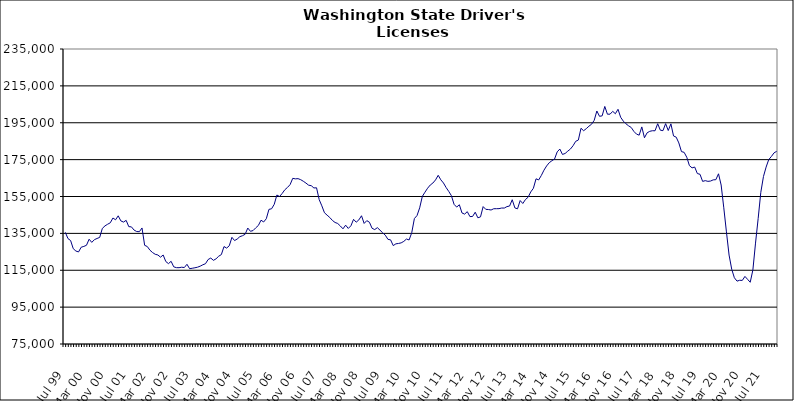
| Category | Series 0 |
|---|---|
| Jul 99 | 135560 |
| Aug 99 | 132182 |
| Sep 99 | 131104 |
| Oct 99 | 126694 |
| Nov 99 | 125425 |
| Dec 99 | 124927 |
| Jan 00 | 127499 |
| Feb 00 | 127927 |
| Mar 00 | 128547 |
| Apr 00 | 131834 |
| May 00 | 130120 |
| Jun 00 | 131595 |
| Jul 00 | 132236 |
| Aug 00 | 132819 |
| Sep 00 | 137711 |
| Oct 00 | 139063 |
| Nov 00 | 139952 |
| Dec 00 | 140732 |
| Jan 01 | 143338 |
| Feb 01 | 142359 |
| Mar 01 | 144523 |
| Apr 01 | 141758 |
| May 01 | 141135 |
| Jun 01 | 142064 |
| Jul 01 | 138646 |
| Aug 01 | 138530 |
| Sep 01 | 136784 |
| Oct 01 | 135996 |
| Nov 01 | 135917 |
| Dec 01 | 137940 |
| Jan 02 | 128531 |
| Feb 02 | 127848 |
| Mar 02 | 125876 |
| Apr 02 | 124595 |
| May 02 | 123660 |
| Jun 02 | 123282 |
| Jul 02 | 122089 |
| Aug 02 | 123279 |
| Sep 02 | 119727 |
| Oct 02 | 118588 |
| Nov 02 | 119854 |
| Dec 02 | 116851 |
| Jan 03 | 116407 |
| Feb 03 | 116382 |
| Mar 03 | 116648 |
| Apr 03 | 116471 |
| May 03 | 118231 |
| Jun 03 | 115831 |
| Jul 03 | 116082 |
| Aug 03 | 116341 |
| Sep 03 | 116653 |
| Oct 03 | 117212 |
| Nov 03 | 117962 |
| Dec 03 | 118542 |
| Jan 04 | 120817 |
| Feb 04 | 121617 |
| Mar 04 | 120369 |
| Apr 04 | 121200 |
| May 04 | 122609 |
| Jun 04 | 123484 |
| Jul 04 | 127844 |
| Aug 04 | 127025 |
| Sep 04 | 128273 |
| Oct 04 | 132853 |
| Nov 04 | 131106 |
| Dec 04 | 131935 |
| Jan 05 | 133205 |
| Feb 05 | 133736 |
| Mar 05 | 134528 |
| Apr 05 | 137889 |
| May 05 | 136130 |
| Jun 05 | 136523 |
| Jul 05 | 137997 |
| Aug 05 | 139294 |
| Sep 05 | 142140 |
| Oct 05 | 141192 |
| Nov 05 | 142937 |
| Dec 05 | 148013 |
| Jan 06 | 148341 |
| Feb 06 | 150744 |
| Mar 06 | 155794 |
| Apr 06 | 154984 |
| May 06 | 156651 |
| Jun 06 | 158638 |
| Jul 06 | 159911 |
| Aug 06 | 161445 |
| Sep 06 | 164852 |
| Oct 06 | 164570 |
| Nov 06 | 164679 |
| Dec 06 | 164127 |
| Jan 07 | 163271 |
| Feb 07 | 162273 |
| Mar 07 | 161140 |
| Apr 07 | 160860 |
| May 07 | 159633 |
| Jun 07 | 159724 |
| Jul 07 | 153303 |
| Aug 07 | 149939 |
| Sep 07 | 146172 |
| Oct 07 | 144876 |
| Nov 07 | 143613 |
| Dec 07 | 142022 |
| Jan 08 | 140909 |
| Feb 08 | 140368 |
| Mar 08 | 138998 |
| Apr 08 | 137471 |
| May 08 | 139453 |
| Jun 08 | 137680 |
| Jul 08 | 139120 |
| Aug 08 | 142612 |
| Sep-08 | 141071 |
| Oct 08 | 142313 |
| Nov 08 | 144556 |
| Dec 08 | 140394 |
| Jan 09 | 141903 |
| Feb 09 | 141036 |
| Mar 09 | 137751 |
| Apr 09 | 137060 |
| May 09 | 138101 |
| Jun 09 | 136739 |
| Jul 09 | 135317 |
| Aug 09 | 134020 |
| Sep 09 | 131756 |
| Oct 09 | 131488 |
| Nov 09 | 128370 |
| Dec 09 | 129323 |
| Jan 10 | 129531 |
| Feb 10 | 129848 |
| Mar 10 | 130654 |
| Apr 10 | 131929 |
| May 10 | 131429 |
| Jun 10 | 135357 |
| Jul 10 | 143032 |
| Aug 10 | 144686 |
| Sep 10 | 148856 |
| Oct 10 | 155042 |
| Nov 10 | 157328 |
| Dec 10 | 159501 |
| Jan 11 | 161221 |
| Feb 11 | 162312 |
| Mar 11 | 163996 |
| Apr 11 | 166495 |
| May 11 | 164040 |
| Jun 11 | 162324 |
| Jul 11 | 159862 |
| Aug 11 | 157738 |
| Sep 11 | 155430 |
| Oct 11 | 150762 |
| Nov 11 | 149255 |
| Dec 11 | 150533 |
| Jan 12 | 146068 |
| Feb 12 | 145446 |
| Mar 12 | 146788 |
| Apr 12 | 144110 |
| May 12 | 144162 |
| Jun 12 | 146482 |
| Jul 12 | 143445 |
| Aug 12 | 143950 |
| Sep 12 | 149520 |
| Oct 12 | 148033 |
| Nov 12 | 147926 |
| Dec 12 | 147674 |
| Jan 13 | 148360 |
| Feb-13 | 148388 |
| Mar-13 | 148414 |
| Apr 13 | 148749 |
| May 13 | 148735 |
| Jun-13 | 149521 |
| Jul 13 | 149837 |
| Aug 13 | 153252 |
| Sep 13 | 148803 |
| Oct 13 | 148315 |
| Nov 13 | 152804 |
| Dec 13 | 151209 |
| Jan 14 | 153357 |
| Feb-14 | 154608 |
| Mar 14 | 157479 |
| Apr 14 | 159441 |
| May 14 | 164591 |
| Jun 14 | 163995 |
| Jul-14 | 166411 |
| Aug-14 | 169272 |
| Sep 14 | 171565 |
| Oct 14 | 173335 |
| Nov 14 | 174406 |
| Dec 14 | 175302 |
| Jan 15 | 179204 |
| Feb 15 | 180737 |
| Mar 15 | 177810 |
| Apr-15 | 178331 |
| May 15 | 179601 |
| Jun-15 | 180729 |
| Jul 15 | 182540 |
| Aug 15 | 184924 |
| Sep 15 | 185620 |
| Oct 15 | 192002 |
| Nov 15 | 190681 |
| Dec 15 | 191795 |
| Jan 16 | 193132 |
| Feb 16 | 194206 |
| Mar 16 | 196319 |
| Apr 16 | 201373 |
| May 16 | 198500 |
| Jun 16 | 198743 |
| Jul 16 | 203841 |
| Aug 16 | 199630 |
| Sep 16 | 199655 |
| Oct 16 | 201181 |
| Nov 16 | 199888 |
| Dec 16 | 202304 |
| Jan 17 | 197977 |
| Feb 17 | 195889 |
| Mar 17 | 194438 |
| Apr 17 | 193335 |
| May 17 | 192430 |
| Jun 17 | 190298 |
| Jul 17 | 188832 |
| Aug 17 | 188264 |
| Sep 17 | 192738 |
| Oct 17 | 186856 |
| Nov 17 | 189537 |
| Dec 17 | 190341 |
| Jan 18 | 190670 |
| Feb 18 | 190645 |
| Mar 18 | 194476 |
| Apr 18 | 190971 |
| May 18 | 190707 |
| Jun 18 | 194516 |
| Jul 18 | 190783 |
| Aug 18 | 194390 |
| Sep 18 | 187831 |
| Oct 18 | 187188 |
| Nov 18 | 184054 |
| Dec 18 | 179347 |
| Jan 19 | 178958 |
| Feb 19 | 176289 |
| Mar 19 | 171747 |
| Apr 19 | 170532 |
| May 19 | 170967 |
| Jun 19 | 167444 |
| Jul 19 | 167059 |
| Aug 19 | 163194 |
| Sep 19 | 163599 |
| Oct 19 | 163212 |
| Nov 19 | 163388 |
| Dec 19 | 164024 |
| Jan 20 | 164114 |
| Feb 20 | 167320 |
| Mar 20 | 161221 |
| Apr 20 | 148866 |
| May 20 | 135821 |
| Jun 20 | 123252 |
| Jul 20 | 115526 |
| Aug 20 | 110940 |
| Sep 20 | 109099 |
| Oct 20 | 109566 |
| Nov 20 | 109488 |
| Dec 20 | 111658 |
| Jan 21 | 110070 |
| Feb 21 | 108491 |
| Mar 21 | 115176 |
| Apr 21 | 129726 |
| May 21 | 143052 |
| Jun 21 | 157253 |
| Jul 21 | 165832 |
| Aug 21 | 170937 |
| Sep 21 | 175042 |
| Oct 21 | 176696 |
| Nov 21 | 178677 |
| Dec 21 | 179501 |